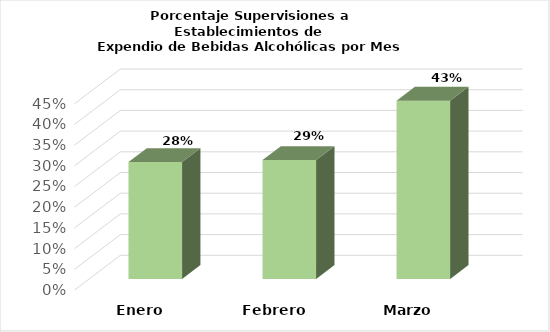
| Category | Series 0 |
|---|---|
| Enero | 0.282 |
| Febrero | 0.287 |
| Marzo | 0.43 |